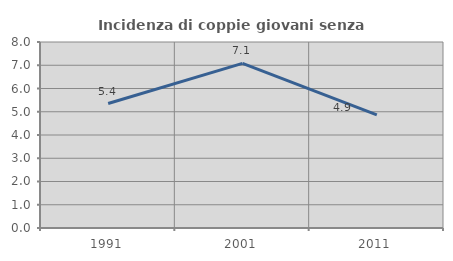
| Category | Incidenza di coppie giovani senza figli |
|---|---|
| 1991.0 | 5.353 |
| 2001.0 | 7.082 |
| 2011.0 | 4.868 |